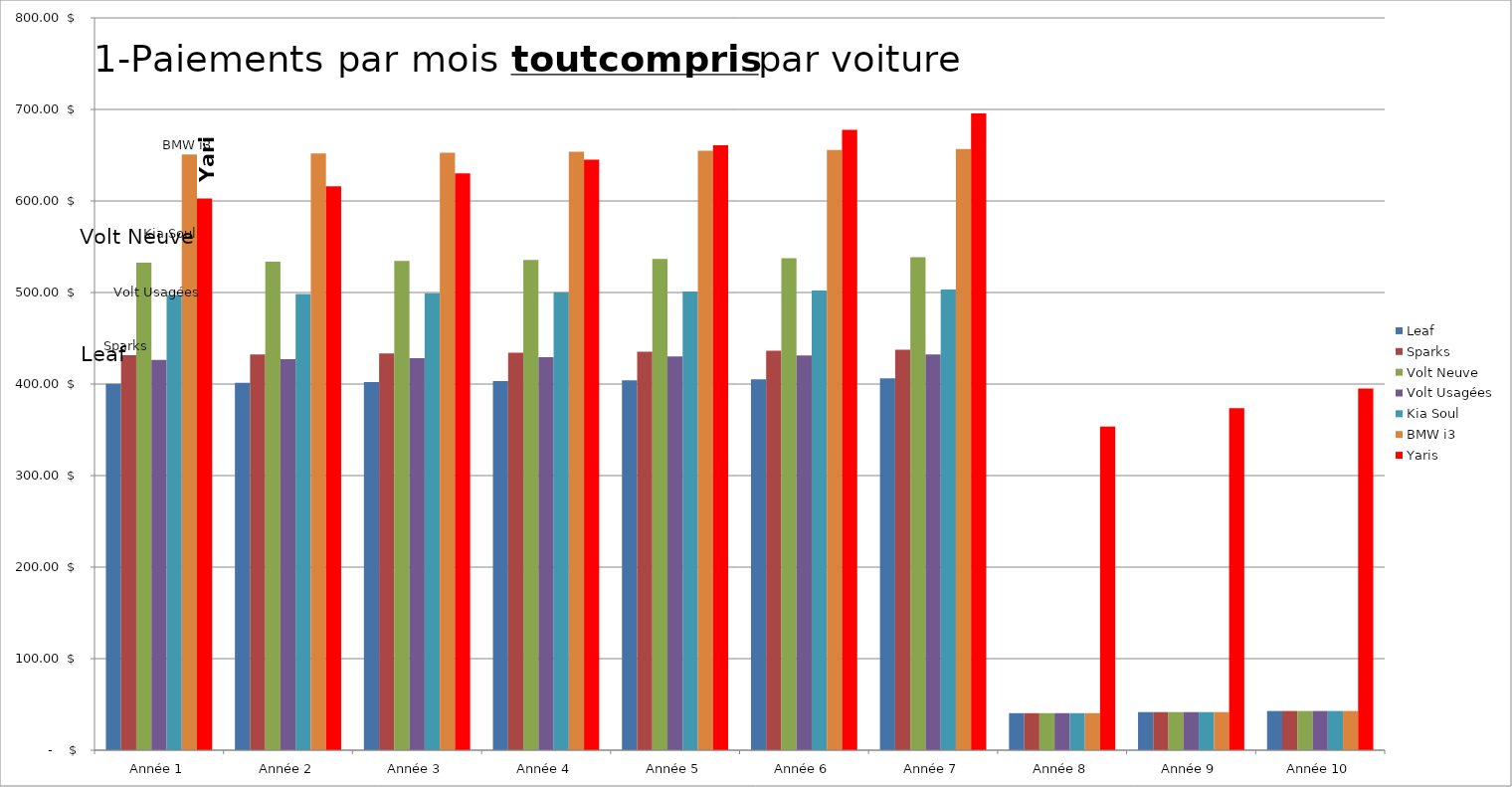
| Category | Leaf | Sparks | Volt Neuve | Volt Usagées | Kia Soul | BMW i3 | Yaris |
|---|---|---|---|---|---|---|---|
| Année 1 | 400.323 | 431.437 | 532.723 | 426.373 | 497.347 | 650.92 | 602.704 |
| Année 2 | 401.24 | 432.353 | 533.64 | 427.29 | 498.263 | 651.837 | 616.037 |
| Année 3 | 402.188 | 433.301 | 534.588 | 428.238 | 499.211 | 652.784 | 630.162 |
| Année 4 | 403.167 | 434.28 | 535.567 | 429.217 | 500.19 | 653.764 | 645.131 |
| Année 5 | 404.18 | 435.293 | 536.58 | 430.23 | 501.203 | 654.777 | 660.999 |
| Année 6 | 405.228 | 436.341 | 537.628 | 431.278 | 502.251 | 655.824 | 677.827 |
| Année 7 | 406.312 | 437.425 | 538.712 | 432.362 | 503.335 | 656.908 | 695.68 |
| Année 8 | 40.443 | 40.443 | 40.443 | 40.443 | 40.443 | 40.443 | 353.59 |
| Année 9 | 41.604 | 41.604 | 41.604 | 41.604 | 41.604 | 41.604 | 373.705 |
| Année 10 | 42.805 | 42.805 | 42.805 | 42.805 | 42.805 | 42.805 | 395.07 |